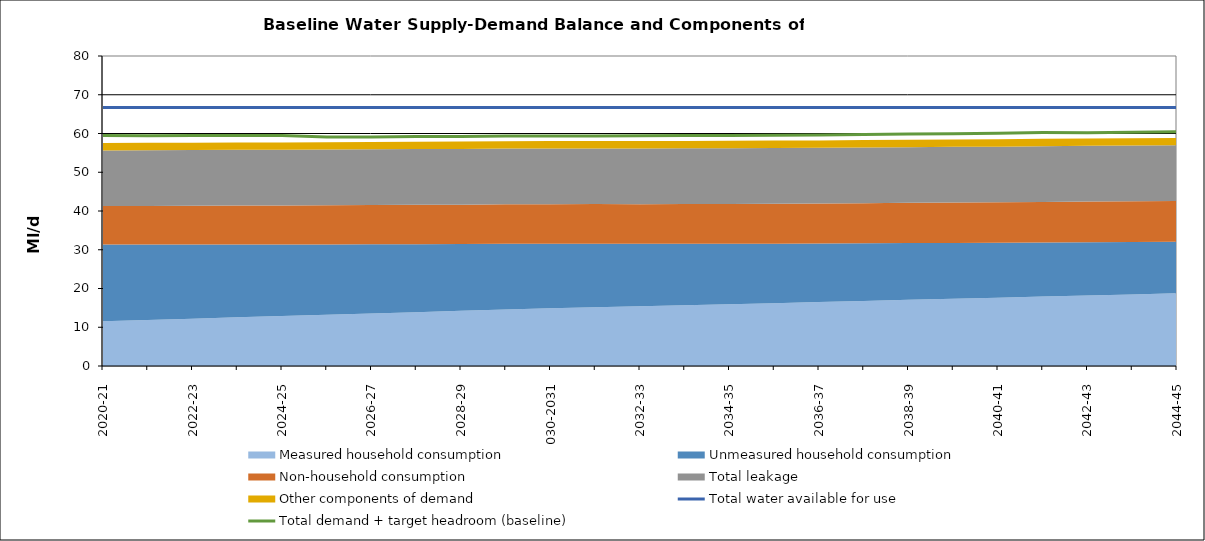
| Category | Total water available for use | Total demand + target headroom (baseline) |
|---|---|---|
| 0 | 66.707 | 59.477 |
| 1 | 66.707 | 59.407 |
| 2 | 66.707 | 59.465 |
| 3 | 66.707 | 59.504 |
| 4 | 66.707 | 59.497 |
| 5 | 66.707 | 59.09 |
| 6 | 66.707 | 59.128 |
| 7 | 66.707 | 59.217 |
| 8 | 66.707 | 59.229 |
| 9 | 66.707 | 59.355 |
| 10 | 66.707 | 59.373 |
| 11 | 66.707 | 59.382 |
| 12 | 66.707 | 59.431 |
| 13 | 66.707 | 59.478 |
| 14 | 66.707 | 59.511 |
| 15 | 66.707 | 59.577 |
| 16 | 66.707 | 59.636 |
| 17 | 66.707 | 59.763 |
| 18 | 66.707 | 59.884 |
| 19 | 66.707 | 59.92 |
| 20 | 66.707 | 60.073 |
| 21 | 66.707 | 60.234 |
| 22 | 66.707 | 60.184 |
| 23 | 66.707 | 60.337 |
| 24 | 66.707 | 60.455 |